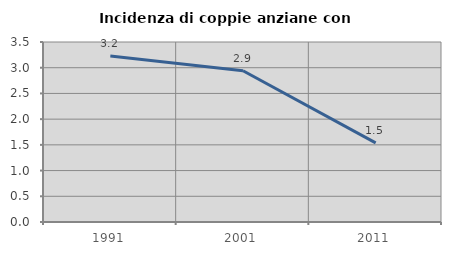
| Category | Incidenza di coppie anziane con figli |
|---|---|
| 1991.0 | 3.226 |
| 2001.0 | 2.941 |
| 2011.0 | 1.538 |